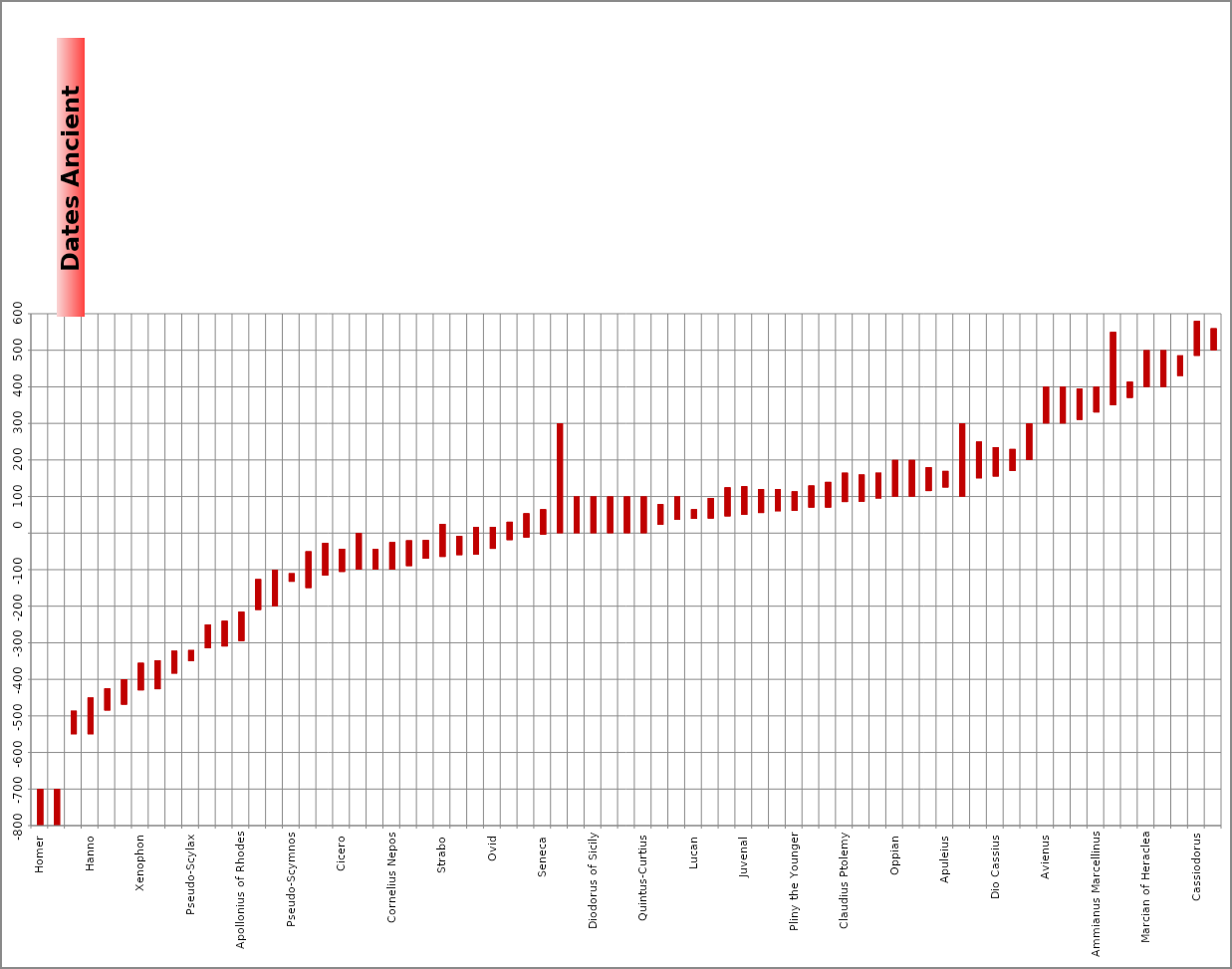
| Category | Begin | End | Halfway |
|---|---|---|---|
| Homer | -800 | -700 | -750 |
| Hesiod | -800 | -700 | -750 |
| Scylax of Caryanda | -550 | -486 | -518 |
| Hanno | -550 | -450 | -500 |
| Herodotus | -485 | -425 | -455 |
| Thucydides | -469 | -400 | -434.5 |
| Xenophon | -430 | -355 | -392.5 |
| Plato | -427 | -348 | -387.5 |
| Demosthenes | -384 | -322 | -353 |
| Pseudo-Scylax | -320 | -350 | -335 |
| Theocritus | -315 | -250 | -282.5 |
| Poseidippos of Pella | -310 | -240 | -275 |
| Apollonius of Rhodes | -295 | -215 | -255 |
| Polybius | -210 | -126 | -168 |
| Apollodorus of Athens | -200 | -100 | -150 |
| Pseudo-Scymnos | -133 | -110 | -121.5 |
| Stadiasmus | -150 | -50 | -100 |
| Marcus Varro | -116 | -27 | -71.5 |
| Cicero | -106 | -43 | -74.5 |
| Antipater of Thessalonica | -100 | 0 | -50 |
| Julius Caesar | -100 | -44 | -72 |
| Cornelius Nepos | -100 | -25 | -62.5 |
| Vitruvius | -90 | -20 | -55 |
| Vergilius | -70 | -19 | -44.5 |
| Strabo | -65 | 25 | -20 |
| Denys of Halicarnassus | -60 | -8 | -34 |
| Titus Livius | -59 | 17 | -21 |
| Ovid | -43 | 17 | -13 |
| Velleius Paterculus | -19 | 31 | 6 |
| Philo of Alexandria | -12 | 54 | 21 |
| Seneca | -4 | 65 | 30.5 |
| Bible | 0 | 300 | 150 |
| Denys Periegetes | 0 | 100 | 50 |
| Diodorus of Sicily | 0 | 100 | 50 |
| St Luc | 0 | 100 | 50 |
| Pomponius Mela | 0 | 100 | 50 |
| Quintus-Curtius | 0 | 100 | 50 |
| Pliny the Elder | 23 | 79 | 51 |
| Josephus Flavius | 37 | 100 | 68.5 |
| Lucan | 39 | 65 | 52 |
| Statius | 40 | 96 | 68 |
| Plutarch | 46 | 125 | 85.5 |
| Juvenal | 50 | 128 | 89 |
| Tacitus | 55 | 120 | 87.5 |
| Valerius Flaccus | 60 | 120 | 90 |
| Pliny the Younger | 61 | 114 | 87.5 |
| Suetonius | 70 | 130 | 100 |
| Florus | 70 | 140 | 105 |
| Claudius Ptolemy | 85 | 165 | 125 |
| Arrian of Nicomedia | 86 | 160 | 123 |
| Appian of Alexandria | 95 | 165 | 130 |
| Oppian | 100 | 200 | 150 |
| Polyaenus | 100 | 200 | 150 |
| Pausanias | 115 | 180 | 147.5 |
| Apuleius | 125 | 170 | 147.5 |
| Xenophon of Ephes | 100 | 300 | 200 |
| Athenaeus of Naucratis | 150 | 250 | 200 |
| Dio Cassius | 155 | 235 | 195 |
| Achilles Tatius | 170 | 230 | 200 |
| Solinus | 200 | 300 | 250 |
| Avienus | 300 | 400 | 350 |
| Vegetius | 300 | 400 | 350 |
| Ausonius | 310 | 395 | 352.5 |
| Ammianus Marcellinus | 330 | 400 | 365 |
| Antonine | 350 | 550 | 450 |
| Synesius of Cyrene | 370 | 414 | 392 |
| Marcian of Heraclea | 400 | 500 | 450 |
| Rutilius Namatianus | 400 | 500 | 450 |
| Sidonius Apollinaris | 430 | 486 | 458 |
| Cassiodorus | 485 | 580 | 532.5 |
| Procopius of Caesarea | 500 | 560 | 530 |